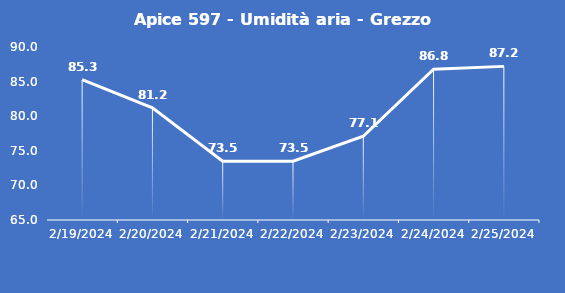
| Category | Apice 597 - Umidità aria - Grezzo (%) |
|---|---|
| 2/19/24 | 85.3 |
| 2/20/24 | 81.2 |
| 2/21/24 | 73.5 |
| 2/22/24 | 73.5 |
| 2/23/24 | 77.1 |
| 2/24/24 | 86.8 |
| 2/25/24 | 87.2 |